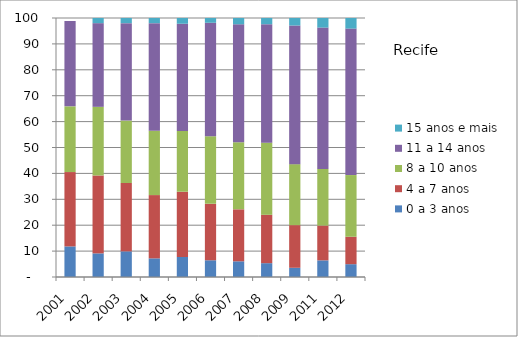
| Category | 0 a 3 anos | 4 a 7 anos | 8 a 10 anos | 11 a 14 anos | 15 anos e mais |
|---|---|---|---|---|---|
| 2001.0 | 11.81 | 28.71 | 25.37 | 32.99 | 0 |
| 2002.0 | 9.12 | 30.08 | 26.5 | 32.31 | 2 |
| 2003.0 | 9.9 | 26.4 | 24.11 | 37.6 | 1.99 |
| 2004.0 | 7.2 | 24.43 | 24.84 | 41.54 | 2 |
| 2005.0 | 7.72 | 25.21 | 23.45 | 41.4 | 2.21 |
| 2006.0 | 6.46 | 21.79 | 26.05 | 43.86 | 1.84 |
| 2007.0 | 6.06 | 20.07 | 25.93 | 45.52 | 2.42 |
| 2008.0 | 5.34 | 18.67 | 27.86 | 45.73 | 2.4 |
| 2009.0 | 3.56 | 16.47 | 23.54 | 53.53 | 2.9 |
| 2011.0 | 6.43 | 13.43 | 21.87 | 54.57 | 3.7 |
| 2012.0 | 4.95 | 10.59 | 23.82 | 56.55 | 4.08 |